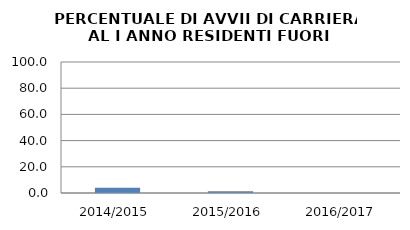
| Category | 2014/2015 2015/2016 2016/2017 |
|---|---|
| 2014/2015 | 3.947 |
| 2015/2016 | 1.299 |
| 2016/2017 | 0 |